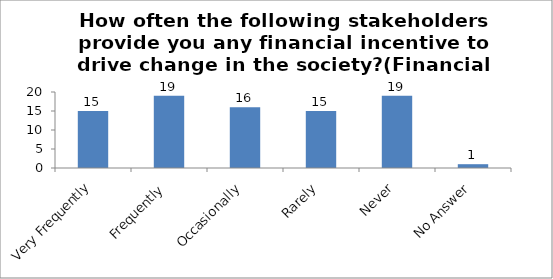
| Category | How often the following stakeholders provide you any financial incentive to drive change in the society?(Financial Institutions) |
|---|---|
| Very Frequently | 15 |
| Frequently | 19 |
| Occasionally | 16 |
| Rarely | 15 |
| Never | 19 |
| No Answer | 1 |